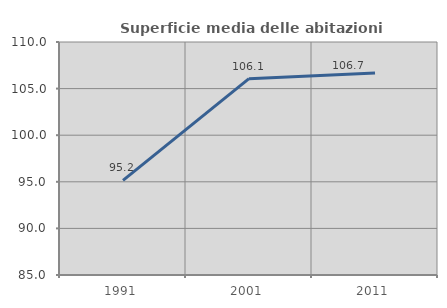
| Category | Superficie media delle abitazioni occupate |
|---|---|
| 1991.0 | 95.161 |
| 2001.0 | 106.068 |
| 2011.0 | 106.672 |